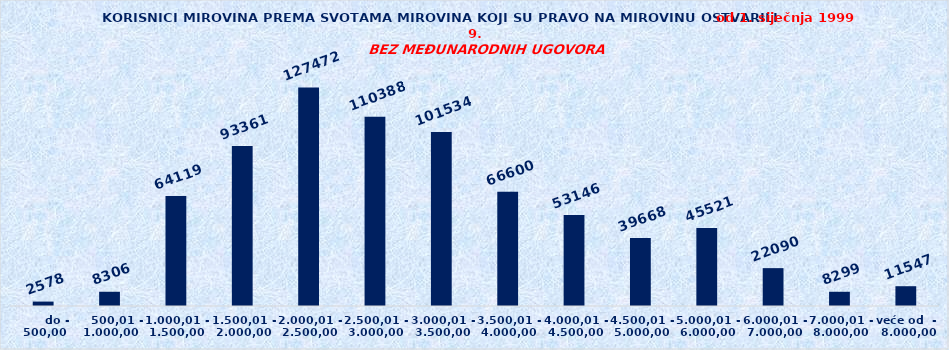
| Category | Series 0 |
|---|---|
|       do - 500,00 | 2578 |
|    500,01 - 1.000,00 | 8306 |
| 1.000,01 - 1.500,00 | 64119 |
| 1.500,01 - 2.000,00 | 93361 |
| 2.000,01 - 2.500,00 | 127472 |
| 2.500,01 - 3.000,00 | 110388 |
| 3.000,01 - 3.500,00 | 101534 |
| 3.500,01 - 4.000,00 | 66600 |
| 4.000,01 - 4.500,00 | 53146 |
| 4.500,01 - 5.000,00 | 39668 |
| 5.000,01 - 6.000,00 | 45521 |
| 6.000,01 - 7.000,00 | 22090 |
| 7.000,01 - 8.000,00 | 8299 |
| veće od  -  8.000,00 | 11547 |